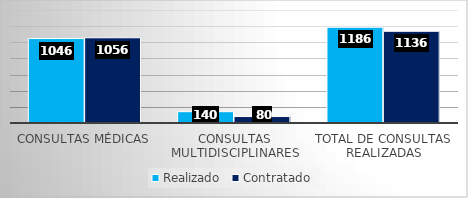
| Category | Realizado | Contratado |
|---|---|---|
| Consultas Médicas | 1046 | 1056 |
| Consultas Multidisciplinares | 140 | 80 |
| Total de Consultas Realizadas | 1186 | 1136 |